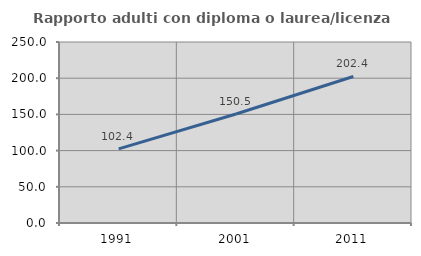
| Category | Rapporto adulti con diploma o laurea/licenza media  |
|---|---|
| 1991.0 | 102.442 |
| 2001.0 | 150.502 |
| 2011.0 | 202.369 |